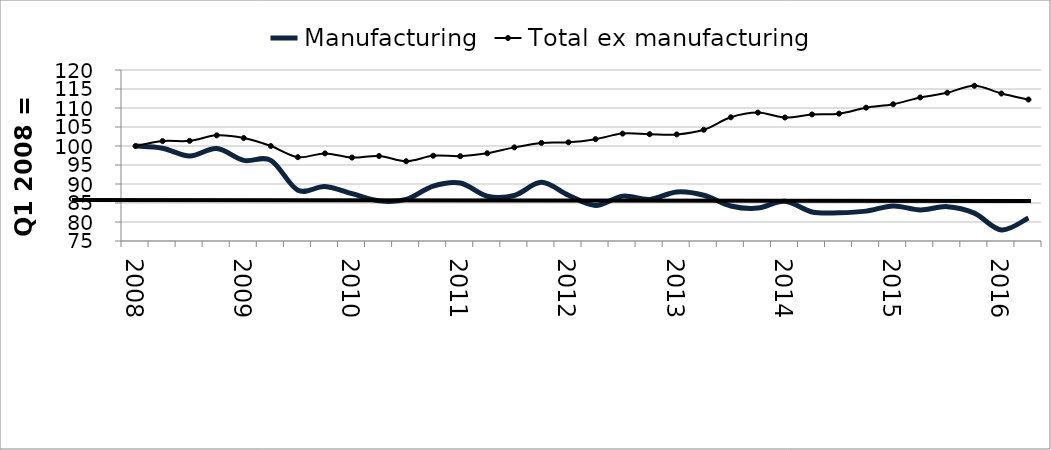
| Category | Manufacturing | Total ex manufacturing |
|---|---|---|
| 2008.0 | 100 | 100 |
| nan | 99.417 | 101.29 |
| nan | 97.35 | 101.352 |
| nan | 99.331 | 102.8 |
| 2009.0 | 96.219 | 102.09 |
| nan | 96.233 | 99.99 |
| nan | 88.354 | 97.063 |
| nan | 89.341 | 98.056 |
| 2010.0 | 87.449 | 96.954 |
| nan | 85.562 | 97.37 |
| nan | 85.95 | 95.998 |
| nan | 89.451 | 97.429 |
| 2011.0 | 90.267 | 97.334 |
| nan | 86.783 | 98.078 |
| nan | 86.979 | 99.639 |
| nan | 90.436 | 100.816 |
| 2012.0 | 87.038 | 100.974 |
| nan | 84.37 | 101.803 |
| nan | 86.807 | 103.265 |
| nan | 85.941 | 103.107 |
| 2013.0 | 87.917 | 103.048 |
| nan | 87.047 | 104.278 |
| nan | 84.224 | 107.554 |
| nan | 83.661 | 108.794 |
| 2014.0 | 85.453 | 107.498 |
| nan | 82.633 | 108.301 |
| nan | 82.438 | 108.515 |
| nan | 82.859 | 110.09 |
| 2015.0 | 84.242 | 110.988 |
| nan | 83.173 | 112.774 |
| nan | 84.038 | 114.016 |
| nan | 82.326 | 115.848 |
| 2016.0 | 77.899 | 113.819 |
| nan | 81.064 | 112.23 |